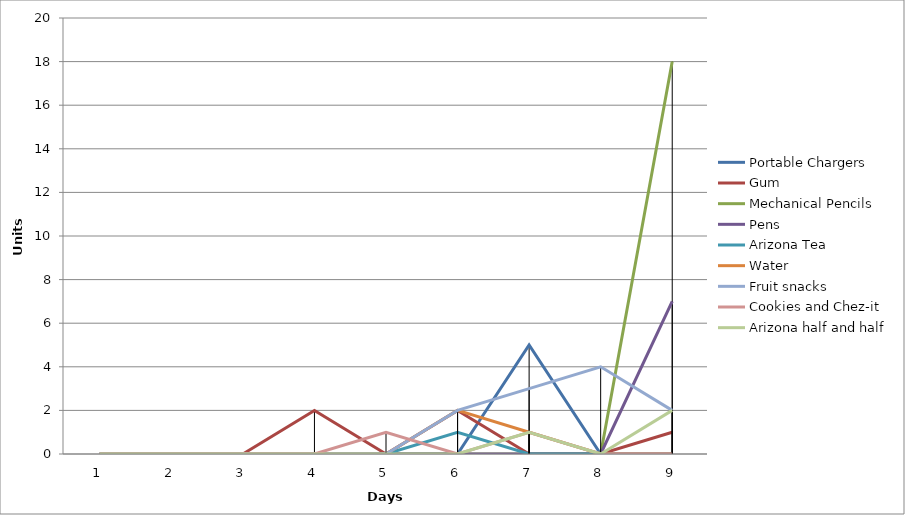
| Category | Portable Chargers | Gum | Mechanical Pencils | Pens | Arizona Tea | Water | Fruit snacks | Cookies and Chez-it | Arizona half and half |
|---|---|---|---|---|---|---|---|---|---|
| 0 | 0 | 0 | 0 | 0 | 0 | 0 | 0 | 0 | 0 |
| 1 | 0 | 0 | 0 | 0 | 0 | 0 | 0 | 0 | 0 |
| 2 | 0 | 0 | 0 | 0 | 0 | 0 | 0 | 0 | 0 |
| 3 | 0 | 2 | 0 | 0 | 0 | 0 | 0 | 0 | 0 |
| 4 | 0 | 0 | 0 | 0 | 0 | 0 | 0 | 1 | 0 |
| 5 | 0 | 2 | 0 | 0 | 1 | 2 | 2 | 0 | 0 |
| 6 | 5 | 0 | 0 | 0 | 0 | 1 | 3 | 1 | 1 |
| 7 | 0 | 0 | 0 | 0 | 0 | 0 | 4 | 0 | 0 |
| 8 | 0 | 1 | 18 | 7 | 0 | 0 | 2 | 0 | 2 |